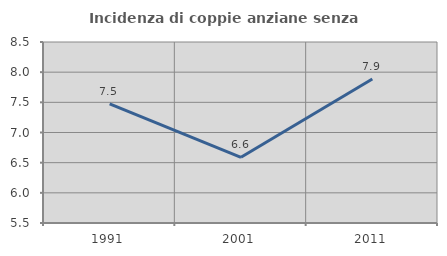
| Category | Incidenza di coppie anziane senza figli  |
|---|---|
| 1991.0 | 7.475 |
| 2001.0 | 6.589 |
| 2011.0 | 7.886 |